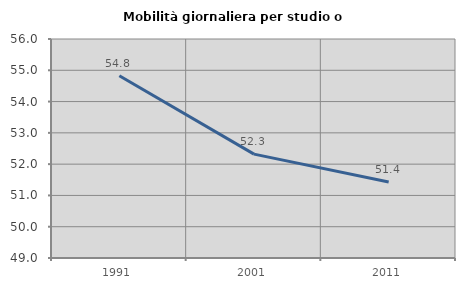
| Category | Mobilità giornaliera per studio o lavoro |
|---|---|
| 1991.0 | 54.826 |
| 2001.0 | 52.32 |
| 2011.0 | 51.43 |